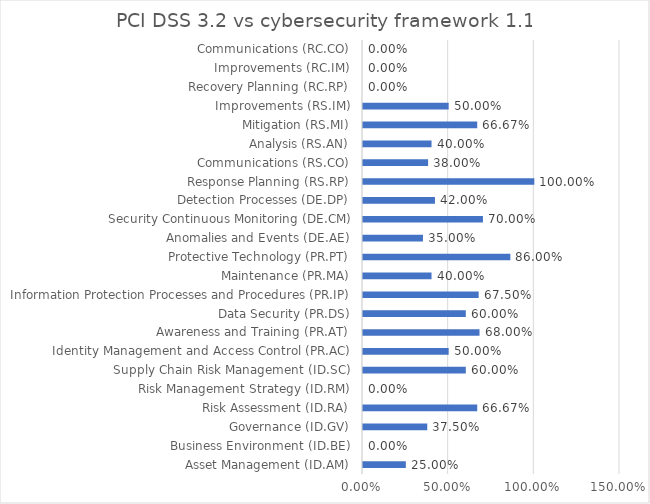
| Category | PCI DSS 3.2 vs cybersecurity framework 1.1 |
|---|---|
| Asset Management (ID.AM) | 0.25 |
| Business Environment (ID.BE) | 0 |
| Governance (ID.GV) | 0.375 |
| Risk Assessment (ID.RA) | 0.667 |
| Risk Management Strategy (ID.RM) | 0 |
| Supply Chain Risk Management (ID.SC) | 0.6 |
| Identity Management and Access Control (PR.AC) | 0.5 |
| Awareness and Training (PR.AT) | 0.68 |
| Data Security (PR.DS) | 0.6 |
| Information Protection Processes and Procedures (PR.IP) | 0.675 |
| Maintenance (PR.MA) | 0.4 |
| Protective Technology (PR.PT) | 0.86 |
| Anomalies and Events (DE.AE) | 0.35 |
| Security Continuous Monitoring (DE.CM) | 0.7 |
| Detection Processes (DE.DP) | 0.42 |
| Response Planning (RS.RP) | 1 |
| Communications (RS.CO) | 0.38 |
| Analysis (RS.AN) | 0.4 |
| Mitigation (RS.MI) | 0.667 |
| Improvements (RS.IM) | 0.5 |
| Recovery Planning (RC.RP) | 0 |
| Improvements (RC.IM) | 0 |
| Communications (RC.CO) | 0 |